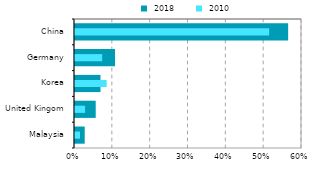
| Category |  2018 |
|---|---|
| Malaysia | 0.026 |
| United Kingom | 0.055 |
| Korea | 0.067 |
| Germany | 0.106 |
| China | 0.563 |